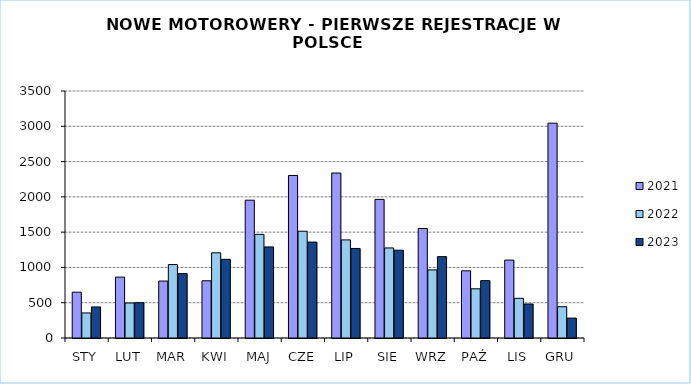
| Category | 2021 | 2022 | 2023 |
|---|---|---|---|
|  STY  | 649 | 355 | 440 |
|  LUT  | 863 | 496 | 501 |
| MAR | 807 | 1041 | 912 |
| KWI | 811 | 1207 | 1115 |
| MAJ | 1953 | 1469 | 1291 |
| CZE | 2303 | 1513 | 1359 |
| LIP | 2338 | 1390 | 1269 |
| SIE | 1964 | 1276 | 1244 |
| WRZ | 1552 | 965 | 1153 |
| PAŹ | 952 | 697 | 813 |
| LIS | 1104 | 562 | 482 |
| GRU | 3044 | 443 | 282 |